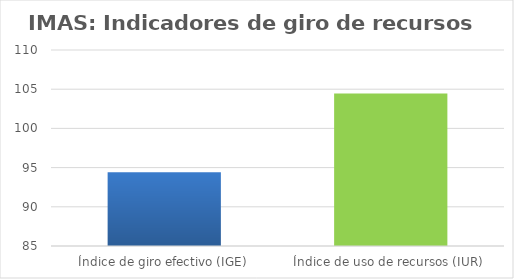
| Category | Series 0 |
|---|---|
| Índice de giro efectivo (IGE) | 94.404 |
| Índice de uso de recursos (IUR)  | 104.436 |